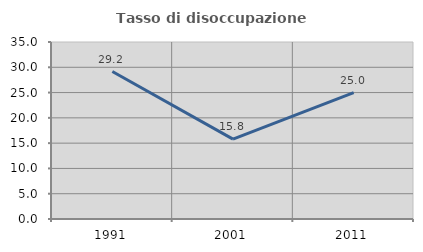
| Category | Tasso di disoccupazione giovanile  |
|---|---|
| 1991.0 | 29.167 |
| 2001.0 | 15.789 |
| 2011.0 | 25 |